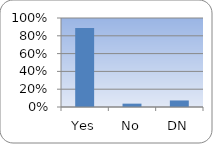
| Category | Series 0 |
|---|---|
| Yes | 0.889 |
| No | 0.038 |
| DN | 0.074 |